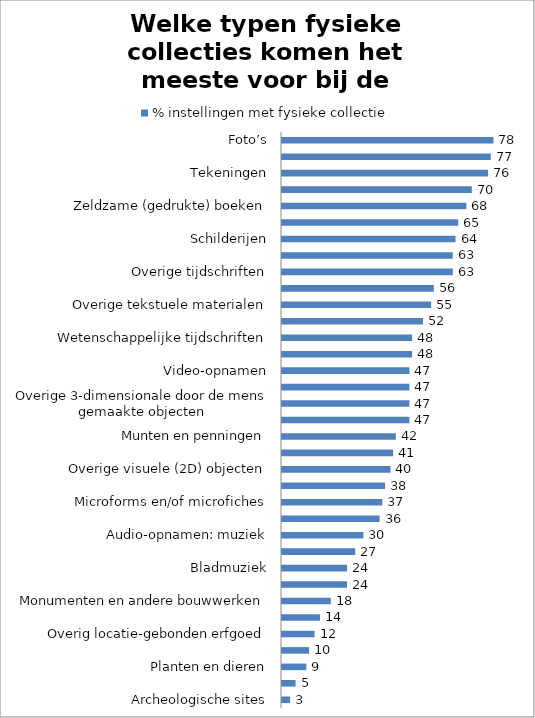
| Category | % instellingen met fysieke collectie |
|---|---|
| Archeologische sites | 3 |
| Landschappen | 5 |
| Planten en dieren | 9 |
| Objecten van anorganisch materiaal | 10 |
| Overig locatie-gebonden erfgoed | 12 |
| Overig time-based | 14 |
| Monumenten en andere bouwwerken | 18 |
| Middeleeuwse handschriften | 24 |
| Bladmuziek | 24 |
| Archaeologische gebruiksvoorwerpen | 27 |
| Audio-opnamen: muziek | 30 |
| Archieven: Overheidsdocumenten | 36 |
| Microforms en/of microfiches | 37 |
| Audio-opnamen: spraak | 38 |
| Overige visuele (2D) objecten | 40 |
| 3-dimensionale kunstwerken | 41 |
| Munten en penningen | 42 |
| Overige handschriften | 47 |
| Overige 3-dimensionale door de mens gemaakte objecten | 47 |
| Film | 47 |
| Video-opnamen | 47 |
| Kranten | 48 |
| Wetenschappelijke tijdschriften | 48 |
| Overige gebruiksvoorwerpen | 52 |
| Overige tekstuele materialen | 55 |
| Posters | 56 |
| Overige tijdschriften | 63 |
| Archieven: Overige archivalia | 63 |
| Schilderijen | 64 |
| Kaarten en plattegronden | 65 |
| Zeldzame (gedrukte) boeken | 68 |
| Graveerwerk / prenten | 70 |
| Tekeningen | 76 |
| Overige gedrukte boeken | 77 |
| Foto’s | 78 |